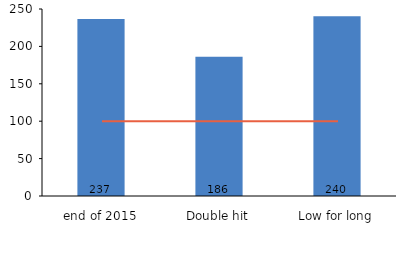
| Category | Series 0 |
|---|---|
| end of 2015 | 236.61 |
| Double hit | 186.24 |
| Low for long | 240.17 |